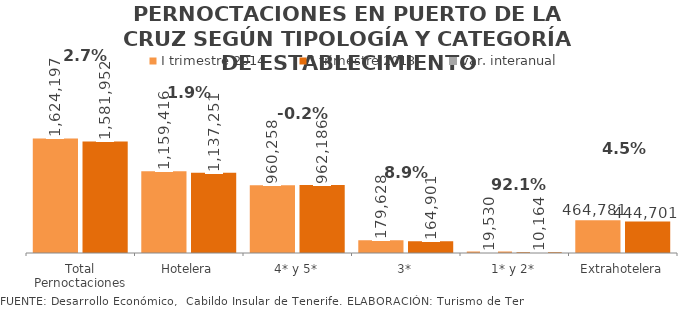
| Category | I trimestre 2014 | I trimestre 2013 |
|---|---|---|
| Total Pernoctaciones | 1624197 | 1581952 |
| Hotelera | 1159416 | 1137251 |
| 4* y 5* | 960258 | 962186 |
| 3* | 179628 | 164901 |
| 1* y 2* | 19530 | 10164 |
| Extrahotelera | 464781 | 444701 |